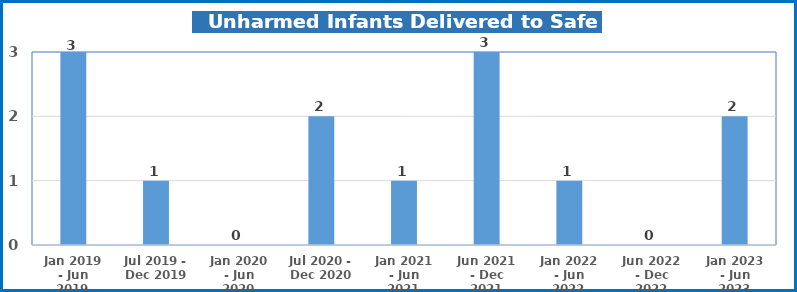
| Category | Series 0 |
|---|---|
| Jan 2019 - Jun 2019 | 3 |
| Jul 2019 - Dec 2019 | 1 |
| Jan 2020 - Jun 2020 | 0 |
| Jul 2020 - Dec 2020 | 2 |
| Jan 2021 - Jun 2021 | 1 |
| Jun 2021 - Dec 2021 | 3 |
| Jan 2022 - Jun 2022 | 1 |
| Jun 2022 - Dec 2022 | 0 |
| Jan 2023 - Jun 2023 | 2 |